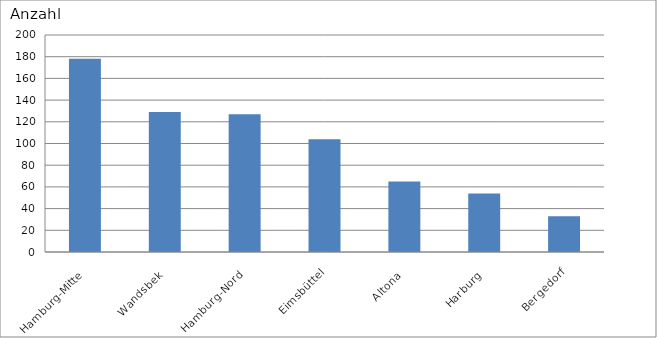
| Category | Hamburg-Mitte Wandsbek Hamburg-Nord Eimsbüttel Altona Harburg Bergedorf |
|---|---|
| Hamburg-Mitte | 178 |
| Wandsbek | 129 |
| Hamburg-Nord | 127 |
| Eimsbüttel | 104 |
| Altona | 65 |
| Harburg | 54 |
| Bergedorf | 33 |